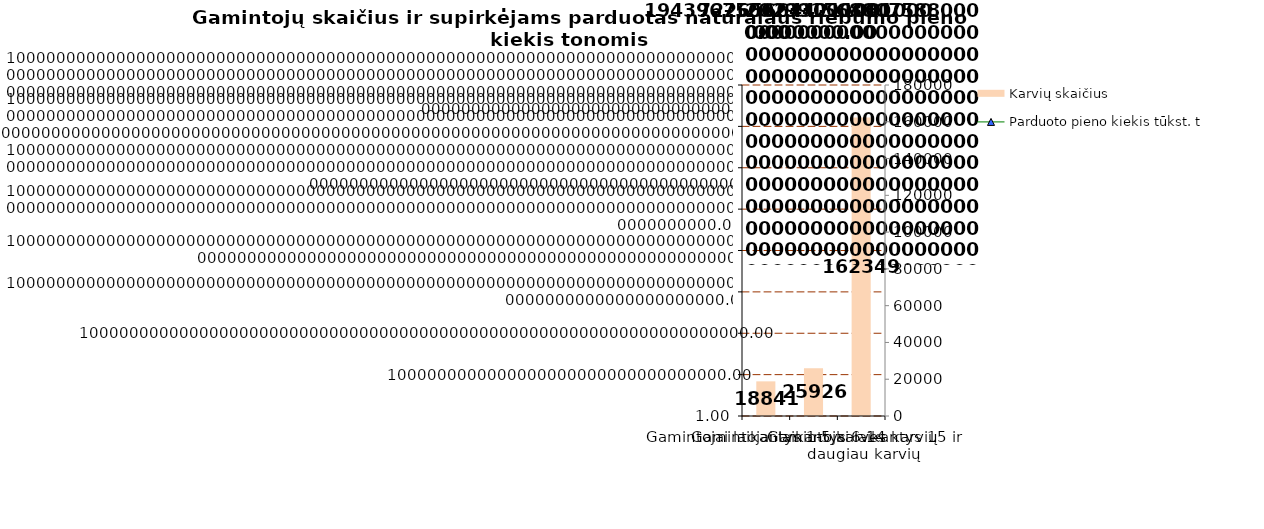
| Category | Karvių skaičius |
|---|---|
| Gamintojai laikantys 1-5 karves | 18841 |
| Gamintojai laikantys 6-14 karvių | 25926 |
| Gamintojai laikantys 15 ir daugiau karvių | 162349 |